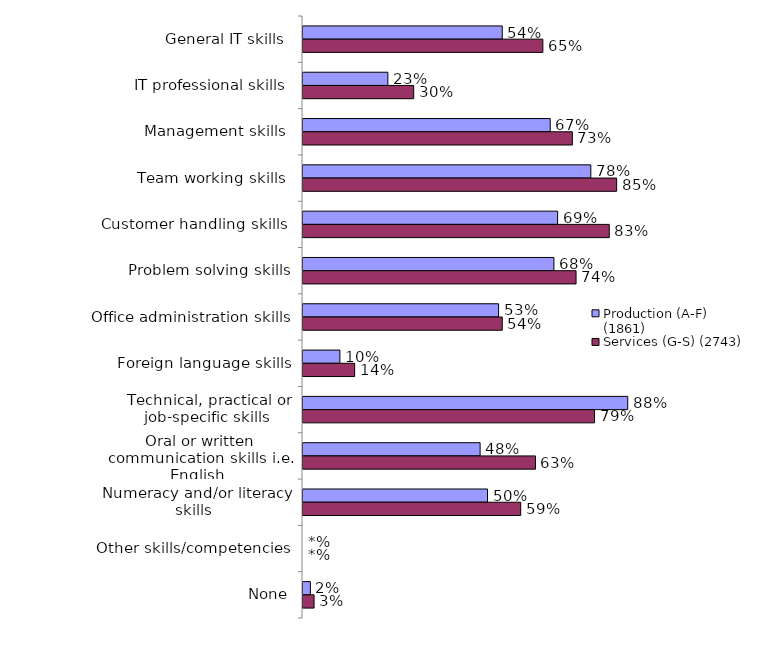
| Category | Production (A-F) (1861) | Services (G-S) (2743) |
|---|---|---|
| General IT skills  | 0.54 | 0.65 |
| IT professional skills  | 0.23 | 0.3 |
| Management skills  | 0.67 | 0.73 |
| Team working skills  | 0.78 | 0.85 |
| Customer handling skills  | 0.69 | 0.83 |
| Problem solving skills | 0.68 | 0.74 |
| Office administration skills  | 0.53 | 0.54 |
| Foreign language skills | 0.1 | 0.14 |
| Technical, practical or job-specific skills  | 0.88 | 0.79 |
| Oral or written communication skills i.e. English  | 0.48 | 0.63 |
| Numeracy and/or literacy skills  | 0.5 | 0.59 |
| Other skills/competencies | 0 | 0 |
| None | 0.02 | 0.03 |